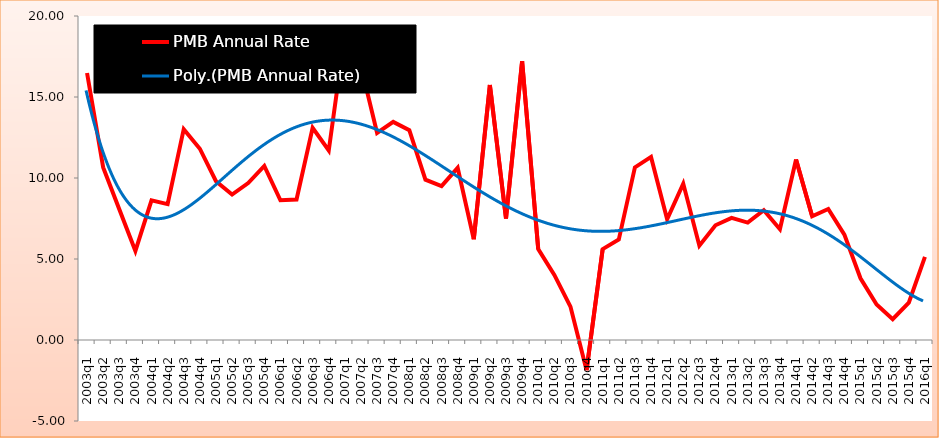
| Category | PMB Annual Rate |
|---|---|
| 2003q1 | 16.484 |
| 2003q2 | 10.653 |
| 2003q3 | 8.077 |
| 2003q4 | 5.498 |
| 2004q1 | 8.622 |
| 2004q2 | 8.384 |
| 2004q3 | 13.013 |
| 2004q4 | 11.807 |
| 2005q1 | 9.8 |
| 2005q2 | 8.977 |
| 2005q3 | 9.688 |
| 2005q4 | 10.745 |
| 2006q1 | 8.628 |
| 2006q2 | 8.672 |
| 2006q3 | 13.091 |
| 2006q4 | 11.701 |
| 2007q1 | 18.906 |
| 2007q2 | 16.896 |
| 2007q3 | 12.778 |
| 2007q4 | 13.461 |
| 2008q1 | 12.951 |
| 2008q2 | 9.895 |
| 2008q3 | 9.504 |
| 2008q4 | 10.625 |
| 2009q1 | 6.222 |
| 2009q2 | 15.74 |
| 2009q3 | 7.502 |
| 2009q4 | 17.204 |
| 2010q1 | 5.608 |
| 2010q2 | 4.017 |
| 2010q3 | 2.062 |
| 2010q4 | -1.86 |
| 2011q1 | 5.611 |
| 2011q2 | 6.198 |
| 2011q3 | 10.655 |
| 2011q4 | 11.304 |
| 2012q1 | 7.453 |
| 2012q2 | 9.653 |
| 2012q3 | 5.82 |
| 2012q4 | 7.082 |
| 2013q1 | 7.538 |
| 2013q2 | 7.246 |
| 2013q3 | 8.014 |
| 2013q4 | 6.837 |
| 2014q1 | 11.141 |
| 2014q2 | 7.635 |
| 2014q3 | 8.088 |
| 2014q4 | 6.503 |
| 2015q1 | 3.809 |
| 2015q2 | 2.19 |
| 2015q3 | 1.289 |
| 2015q4 | 2.303 |
| 2016q1 | 5.132 |